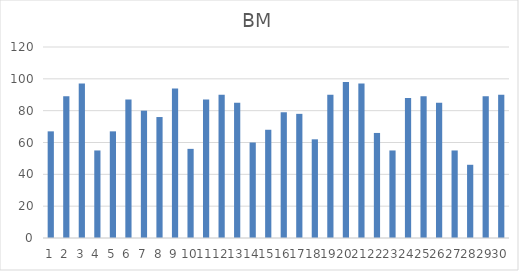
| Category | BM |
|---|---|
| 0 | 67 |
| 1 | 89 |
| 2 | 97 |
| 3 | 55 |
| 4 | 67 |
| 5 | 87 |
| 6 | 80 |
| 7 | 76 |
| 8 | 94 |
| 9 | 56 |
| 10 | 87 |
| 11 | 90 |
| 12 | 85 |
| 13 | 60 |
| 14 | 68 |
| 15 | 79 |
| 16 | 78 |
| 17 | 62 |
| 18 | 90 |
| 19 | 98 |
| 20 | 97 |
| 21 | 66 |
| 22 | 55 |
| 23 | 88 |
| 24 | 89 |
| 25 | 85 |
| 26 | 55 |
| 27 | 46 |
| 28 | 89 |
| 29 | 90 |